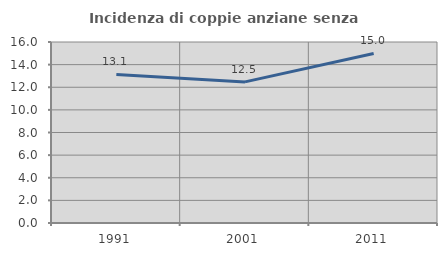
| Category | Incidenza di coppie anziane senza figli  |
|---|---|
| 1991.0 | 13.134 |
| 2001.0 | 12.472 |
| 2011.0 | 14.988 |